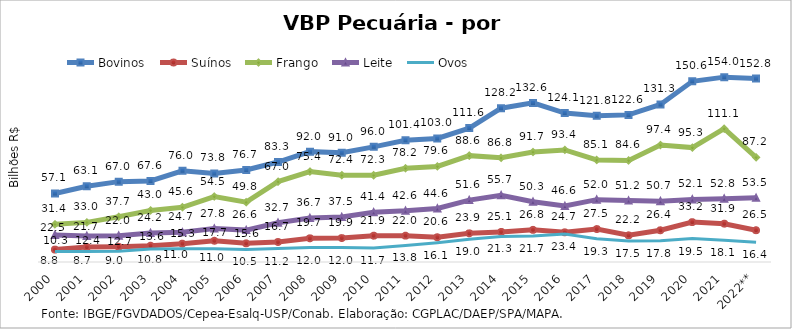
| Category | Bovinos | Suínos | Frango | Leite | Ovos |
|---|---|---|---|---|---|
| 2000 | 57.088 | 10.337 | 31.413 | 22.549 | 8.817 |
| 2001 | 63.105 | 12.401 | 33.017 | 21.699 | 8.688 |
| 2002 | 66.967 | 12.71 | 37.688 | 21.972 | 8.951 |
| 2003 | 67.587 | 13.584 | 42.968 | 24.196 | 10.827 |
| 2004 | 76.043 | 15.272 | 45.626 | 24.729 | 10.974 |
| 2005 | 73.827 | 17.707 | 54.549 | 27.813 | 11.048 |
| 2006 | 76.651 | 15.576 | 49.833 | 26.566 | 10.495 |
| 2007 | 83.302 | 16.655 | 66.955 | 32.659 | 11.154 |
| 2008 | 91.975 | 19.722 | 75.37 | 36.74 | 12.046 |
| 2009 | 91.016 | 19.936 | 72.366 | 37.457 | 12.011 |
| 2010 | 95.958 | 21.931 | 72.278 | 41.366 | 11.682 |
| 2011 | 101.442 | 21.966 | 78.173 | 42.643 | 13.765 |
| 2012 | 102.954 | 20.625 | 79.632 | 44.56 | 16.136 |
| 2013 | 111.566 | 23.88 | 88.631 | 51.565 | 18.978 |
| 2014 | 128.169 | 25.082 | 86.838 | 55.683 | 21.322 |
| 2015 | 132.58 | 26.805 | 91.674 | 50.264 | 21.71 |
| 2016 | 124.101 | 24.737 | 93.41 | 46.639 | 23.405 |
| 2017 | 121.784 | 27.461 | 85.08 | 51.966 | 19.292 |
| 2018 | 122.6 | 22.239 | 84.616 | 51.193 | 17.543 |
| 2019 | 131.278 | 26.434 | 97.427 | 50.719 | 17.767 |
| 2020 | 150.584 | 33.227 | 95.319 | 52.146 | 19.512 |
| 2021 | 154.048 | 31.928 | 111.119 | 52.796 | 18.077 |
| 2022** | 152.836 | 26.504 | 87.19 | 53.505 | 16.374 |